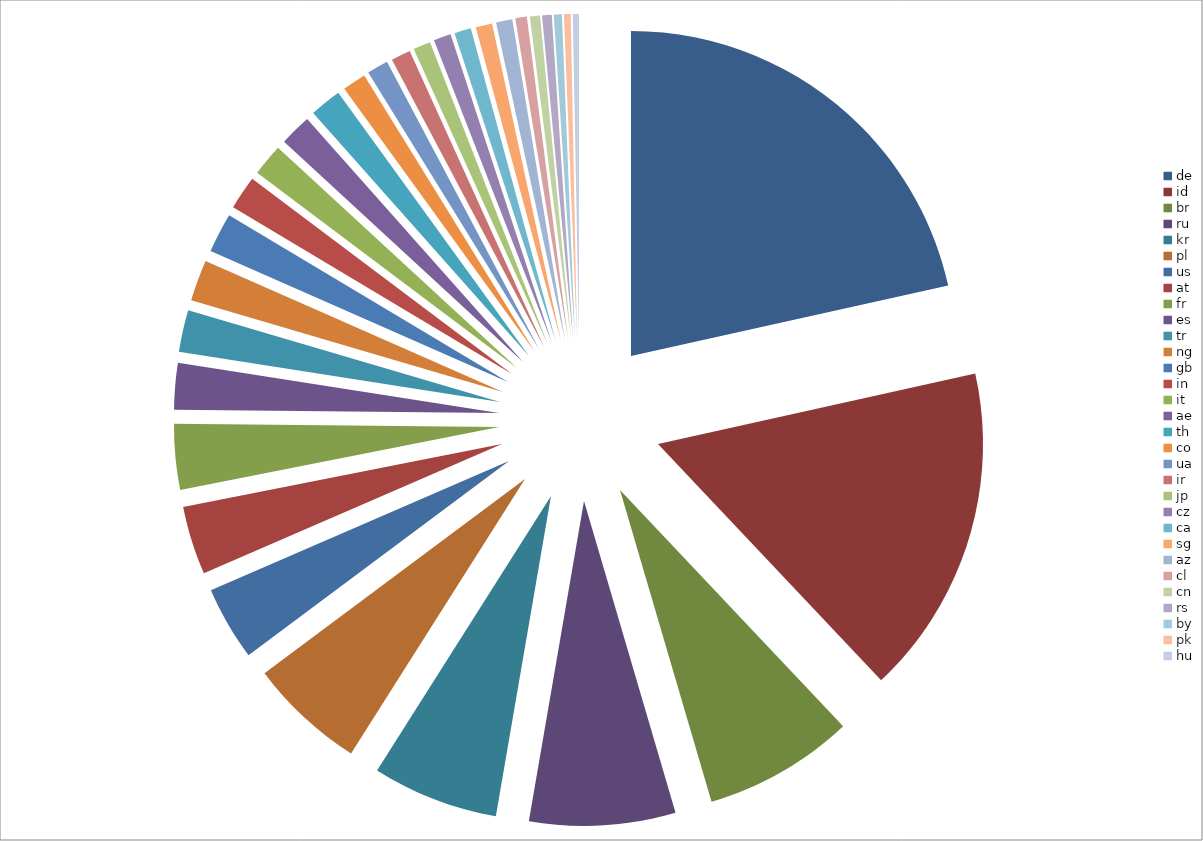
| Category | Series 0 |
|---|---|
| de | 14761711 |
| id | 11278250 |
| br | 5145814 |
| ru | 4980729 |
| kr | 4305169 |
| pl | 3986041 |
| us | 2528583 |
| at | 2339054 |
| fr | 2240133 |
| es | 1587785 |
| tr | 1425449 |
| ng | 1406242 |
| gb | 1358402 |
| in | 1149083 |
| it | 1096813 |
| ae | 1087067 |
| th | 1083480 |
| co | 808239 |
| ua | 724615 |
| ir | 664110 |
| jp | 594919 |
| cz | 589780 |
| ca | 569615 |
| sg | 561630 |
| az | 555535 |
| cl | 392009 |
| cn | 344879 |
| rs | 327002 |
| by | 274921 |
| pk | 230683 |
| hu | 210550 |